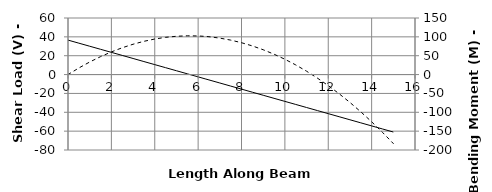
| Category | V |
|---|---|
| 0.0 | 36.562 |
| 0.0 | 36.562 |
| 0.5 | 33.312 |
| 1.0 | 30.062 |
| 1.5 | 26.813 |
| 2.0 | 23.562 |
| 2.5 | 20.312 |
| 3.0 | 17.062 |
| 3.5 | 13.812 |
| 4.0 | 10.562 |
| 4.5 | 7.313 |
| 5.0 | 4.063 |
| 5.5 | 0.813 |
| 6.0 | -2.438 |
| 6.3225 | -4.534 |
| 6.3225 | -4.534 |
| 6.5 | -5.688 |
| 7.0 | -8.938 |
| 7.5 | -12.188 |
| 8.0 | -15.438 |
| 8.5 | -18.688 |
| 9.0 | -21.937 |
| 9.5 | -25.187 |
| 10.0 | -28.437 |
| 10.5 | -31.687 |
| 11.0 | -34.937 |
| 11.5 | -38.188 |
| 12.0 | -41.438 |
| 12.5 | -44.688 |
| 13.0 | -47.938 |
| 13.5 | -51.188 |
| 14.0 | -54.438 |
| 14.5 | -57.688 |
| 15.0 | -60.938 |